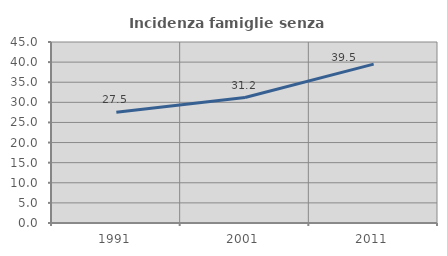
| Category | Incidenza famiglie senza nuclei |
|---|---|
| 1991.0 | 27.517 |
| 2001.0 | 31.2 |
| 2011.0 | 39.493 |